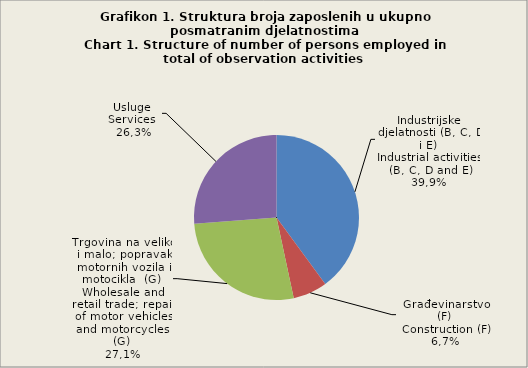
| Category | Broj zaposlenih osoba
Number of persons employed
  0 |
|---|---|
| Industrijske djelatnosti (B, C, D i E)
Industrial activities (B, C, D and E) | 39.9 |
| Građevinarstvo (F)
Construction (F) | 6.7 |
| Trgovina na veliko i malo; popravak motornih vozila i motocikla  (G) 
Wholesale and retail trade; repair of motor vehicles and motorcycles  (G)
 | 27.1 |
| Usluge 
Services  | 26.2 |